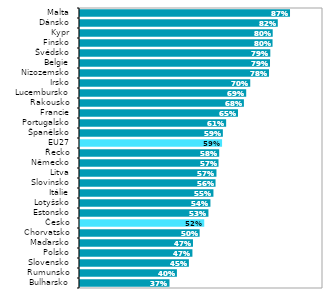
| Category | Series 0 |
|---|---|
| Bulharsko | 0.372 |
| Rumunsko | 0.403 |
| Slovensko | 0.452 |
| Polsko | 0.467 |
| Maďarsko | 0.469 |
| Chorvatsko | 0.496 |
| Česko | 0.515 |
| Estonsko | 0.533 |
| Lotyšsko | 0.541 |
| Itálie | 0.553 |
| Slovinsko | 0.562 |
| Litva | 0.566 |
| Německo | 0.574 |
| Řecko | 0.577 |
| EU27 | 0.589 |
| Španělsko | 0.592 |
| Portugalsko | 0.606 |
| Francie | 0.654 |
| Rakousko | 0.679 |
| Lucembursko | 0.688 |
| Irsko | 0.705 |
| Nizozemsko | 0.782 |
| Belgie | 0.786 |
| Švédsko | 0.787 |
| Finsko | 0.796 |
| Kypr | 0.797 |
| Dánsko | 0.818 |
| Malta | 0.868 |